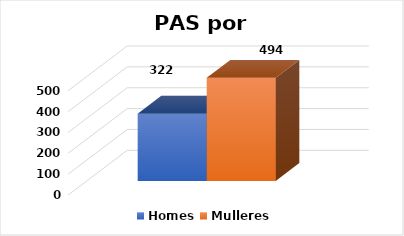
| Category | Homes | Mulleres |
|---|---|---|
| 0 | 322 | 494 |